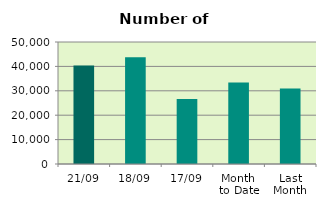
| Category | Series 0 |
|---|---|
| 21/09 | 40396 |
| 18/09 | 43746 |
| 17/09 | 26624 |
| Month 
to Date | 33383.6 |
| Last
Month | 30949.143 |